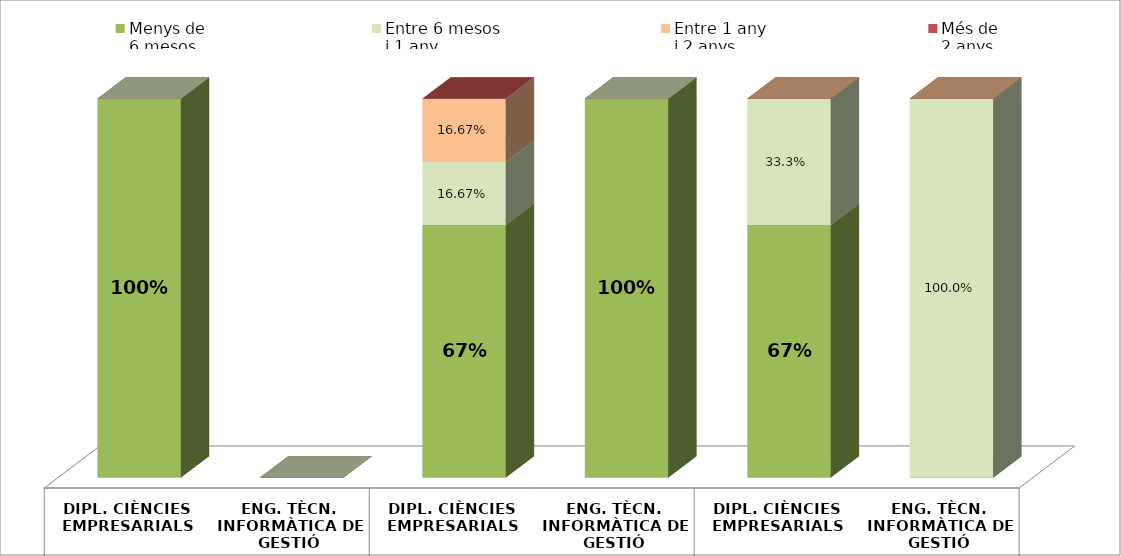
| Category | Menys de 
6 mesos | Entre 6 mesos
i 1 any | Entre 1 any
i 2 anys | Més de
2 anys |
|---|---|---|---|---|
| 0 | 1 | 0 | 0 | 0 |
| 1 | 0 | 0 | 0 | 0 |
| 2 | 0.667 | 0.167 | 0.167 | 0 |
| 3 | 1 | 0 | 0 | 0 |
| 4 | 0.667 | 0.333 | 0 | 0 |
| 5 | 0 | 1 | 0 | 0 |